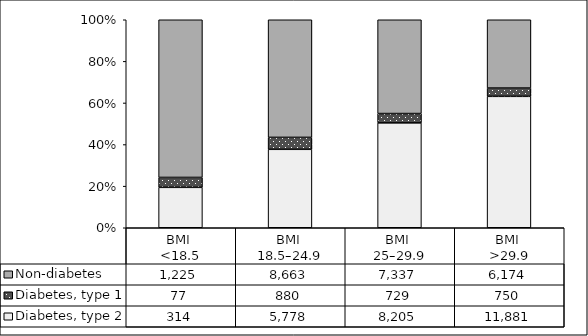
| Category | Diabetes, type 2 | Diabetes, type 1 | Non-diabetes |
|---|---|---|---|
| BMI 
<18.5 | 314 | 77 | 1225 |
| BMI 
18.5–24.9 | 5778 | 880 | 8663 |
| BMI 
25–29.9 | 8205 | 729 | 7337 |
| BMI 
>29.9 | 11881 | 750 | 6174 |